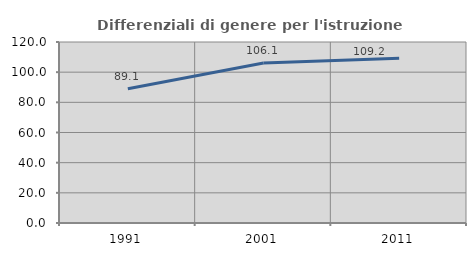
| Category | Differenziali di genere per l'istruzione superiore |
|---|---|
| 1991.0 | 89.053 |
| 2001.0 | 106.09 |
| 2011.0 | 109.239 |